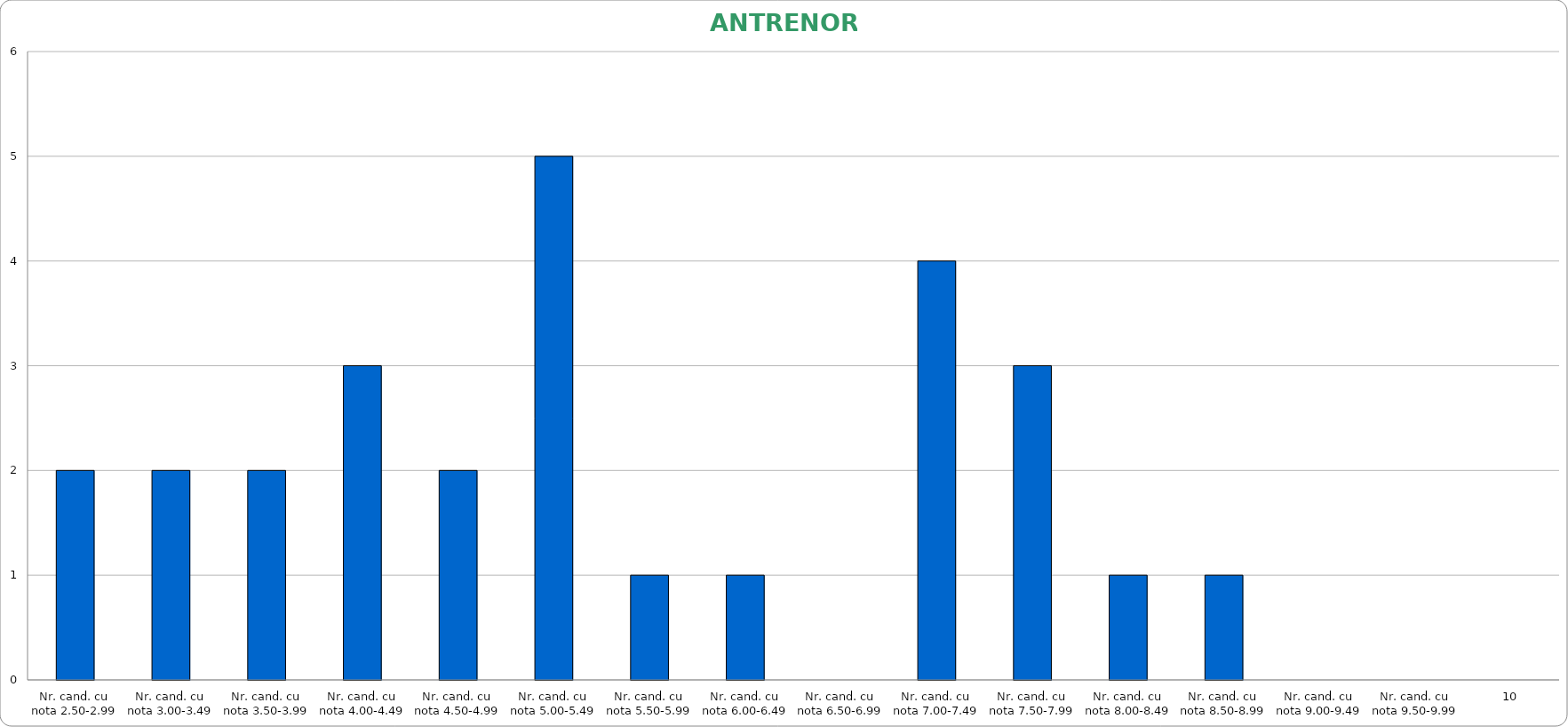
| Category | Series 0 |
|---|---|
| Nr. cand. cu nota 2.50-2.99 | 2 |
| Nr. cand. cu nota 3.00-3.49 | 2 |
| Nr. cand. cu nota 3.50-3.99 | 2 |
| Nr. cand. cu nota 4.00-4.49 | 3 |
| Nr. cand. cu nota 4.50-4.99 | 2 |
| Nr. cand. cu nota 5.00-5.49 | 5 |
| Nr. cand. cu nota 5.50-5.99 | 1 |
| Nr. cand. cu nota 6.00-6.49 | 1 |
| Nr. cand. cu nota 6.50-6.99 | 0 |
| Nr. cand. cu nota 7.00-7.49 | 4 |
| Nr. cand. cu nota 7.50-7.99 | 3 |
| Nr. cand. cu nota 8.00-8.49 | 1 |
| Nr. cand. cu nota 8.50-8.99 | 1 |
| Nr. cand. cu nota 9.00-9.49 | 0 |
| Nr. cand. cu nota 9.50-9.99 | 0 |
| 10 | 0 |